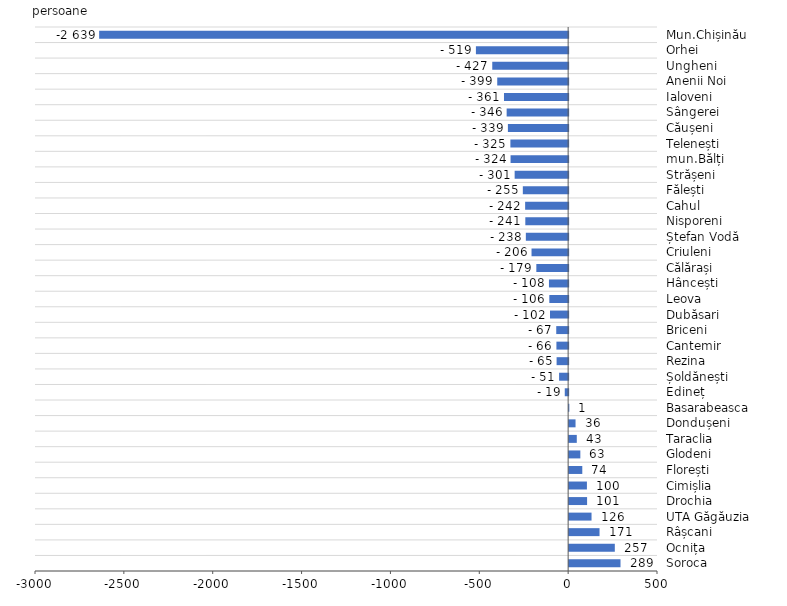
| Category | 2021 |
|---|---|
| Soroca | 289 |
| Ocnița | 257 |
| Râșcani | 171 |
| UTA Găgăuzia | 126 |
| Drochia | 101 |
| Cimișlia | 100 |
| Florești | 74 |
| Glodeni | 63 |
| Taraclia | 43 |
| Dondușeni | 36 |
| Basarabeasca | 1 |
| Edineț | -19 |
| Șoldănești | -51 |
| Rezina | -65 |
| Cantemir | -66 |
| Briceni | -67 |
| Dubăsari | -102 |
| Leova | -106 |
| Hâncești | -108 |
| Călărași | -179 |
| Criuleni | -206 |
| Ștefan Vodă | -238 |
| Nisporeni | -241 |
| Cahul | -242 |
| Fălești | -255 |
| Strășeni | -301 |
| mun.Bălți | -324 |
| Telenești | -325 |
| Căușeni | -339 |
| Sângerei | -346 |
| Ialoveni | -361 |
| Anenii Noi | -399 |
| Ungheni | -427 |
| Orhei | -519 |
| Mun.Chișinău | -2639 |